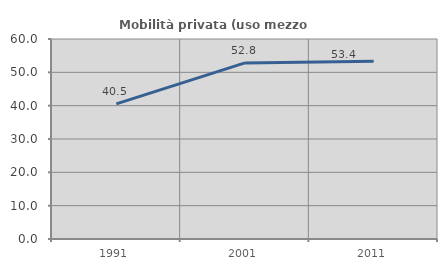
| Category | Mobilità privata (uso mezzo privato) |
|---|---|
| 1991.0 | 40.547 |
| 2001.0 | 52.825 |
| 2011.0 | 53.352 |